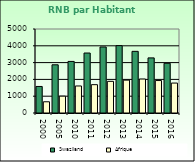
| Category | Swaziland | Afrique                        |
|---|---|---|
| 2000.0 | 1580 | 668.557 |
| 2005.0 | 2870 | 1002.896 |
| 2010.0 | 3070 | 1608.999 |
| 2011.0 | 3570 | 1686.521 |
| 2012.0 | 3930 | 1885.129 |
| 2013.0 | 4010 | 1956.671 |
| 2014.0 | 3670 | 2022.289 |
| 2015.0 | 3280 | 1932.283 |
| 2016.0 | 2960 | 1781.415 |